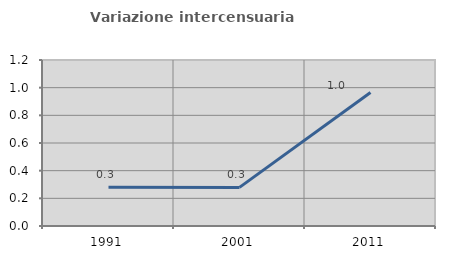
| Category | Variazione intercensuaria annua |
|---|---|
| 1991.0 | 0.281 |
| 2001.0 | 0.279 |
| 2011.0 | 0.964 |